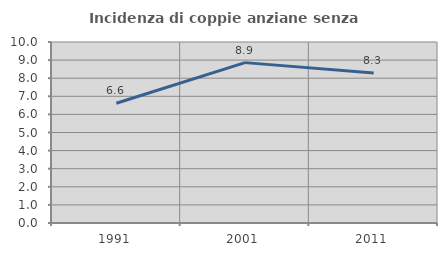
| Category | Incidenza di coppie anziane senza figli  |
|---|---|
| 1991.0 | 6.618 |
| 2001.0 | 8.861 |
| 2011.0 | 8.284 |